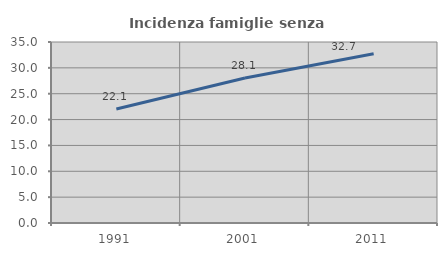
| Category | Incidenza famiglie senza nuclei |
|---|---|
| 1991.0 | 22.052 |
| 2001.0 | 28.055 |
| 2011.0 | 32.723 |